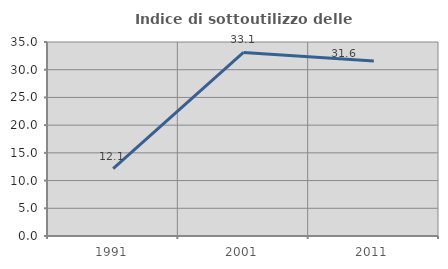
| Category | Indice di sottoutilizzo delle abitazioni  |
|---|---|
| 1991.0 | 12.139 |
| 2001.0 | 33.108 |
| 2011.0 | 31.579 |